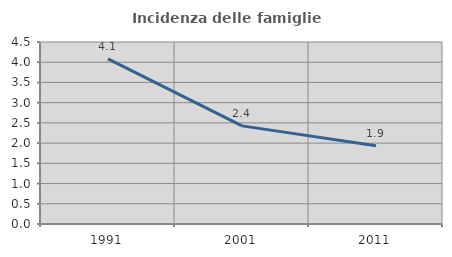
| Category | Incidenza delle famiglie numerose |
|---|---|
| 1991.0 | 4.082 |
| 2001.0 | 2.427 |
| 2011.0 | 1.933 |